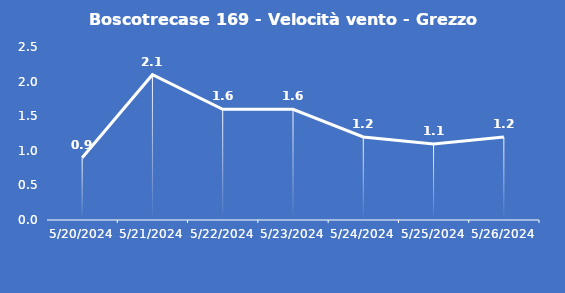
| Category | Boscotrecase 169 - Velocità vento - Grezzo (m/s) |
|---|---|
| 5/20/24 | 0.9 |
| 5/21/24 | 2.1 |
| 5/22/24 | 1.6 |
| 5/23/24 | 1.6 |
| 5/24/24 | 1.2 |
| 5/25/24 | 1.1 |
| 5/26/24 | 1.2 |